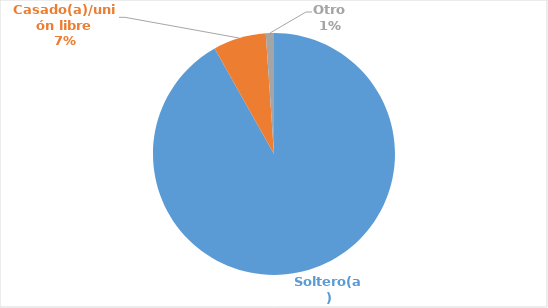
| Category | Series 0 |
|---|---|
| Soltero(a) | 0.918 |
| Casado(a)/unión libre | 0.071 |
| Otro | 0.011 |